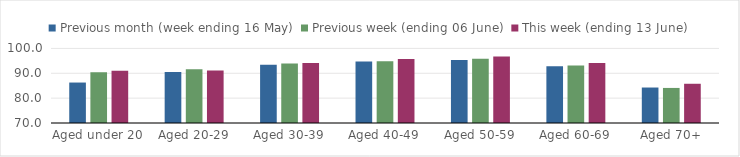
| Category | Previous month (week ending 16 May) | Previous week (ending 06 June) | This week (ending 13 June) |
|---|---|---|---|
| Aged under 20 | 86.277 | 90.419 | 90.991 |
| Aged 20-29 | 90.523 | 91.646 | 91.111 |
| Aged 30-39 | 93.442 | 93.929 | 94.162 |
| Aged 40-49 | 94.773 | 94.833 | 95.797 |
| Aged 50-59 | 95.349 | 95.803 | 96.794 |
| Aged 60-69 | 92.786 | 93.103 | 94.12 |
| Aged 70+ | 84.272 | 84.106 | 85.783 |